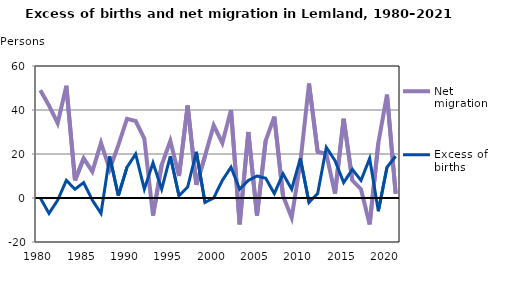
| Category | Net migration | Excess of births |
|---|---|---|
| 1980.0 | 49 | 0 |
| 1981.0 | 42 | -7 |
| 1982.0 | 34 | -1 |
| 1983.0 | 51 | 8 |
| 1984.0 | 8 | 4 |
| 1985.0 | 18 | 7 |
| 1986.0 | 12 | -1 |
| 1987.0 | 25 | -7 |
| 1988.0 | 13 | 19 |
| 1989.0 | 24 | 1 |
| 1990.0 | 36 | 14 |
| 1991.0 | 35 | 20 |
| 1992.0 | 27 | 4 |
| 1993.0 | -8 | 16 |
| 1994.0 | 15 | 4 |
| 1995.0 | 26 | 19 |
| 1996.0 | 10 | 1 |
| 1997.0 | 42 | 5 |
| 1998.0 | 6 | 21 |
| 1999.0 | 19 | -2 |
| 2000.0 | 33 | 0 |
| 2001.0 | 25 | 8 |
| 2002.0 | 40 | 14 |
| 2003.0 | -12 | 4 |
| 2004.0 | 30 | 8 |
| 2005.0 | -8 | 10 |
| 2006.0 | 26 | 9 |
| 2007.0 | 37 | 2 |
| 2008.0 | 1 | 11 |
| 2009.0 | -9 | 4 |
| 2010.0 | 16 | 18 |
| 2011.0 | 52 | -2 |
| 2012.0 | 21 | 2 |
| 2013.0 | 20 | 23 |
| 2014.0 | 2 | 17 |
| 2015.0 | 36 | 7 |
| 2016.0 | 8 | 13 |
| 2017.0 | 4 | 8 |
| 2018.0 | -12 | 18 |
| 2019.0 | 25 | -6 |
| 2020.0 | 47 | 14 |
| 2021.0 | 2 | 19 |